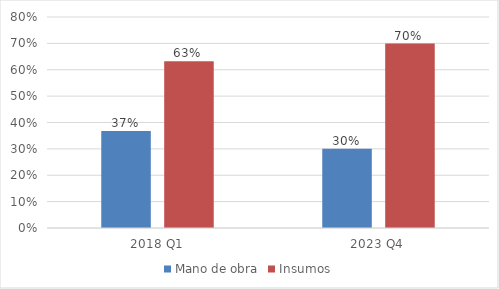
| Category | Mano de obra | Insumos |
|---|---|---|
| 2018 Q1 | 0.368 | 0.632 |
| 2023 Q4 | 0.301 | 0.699 |